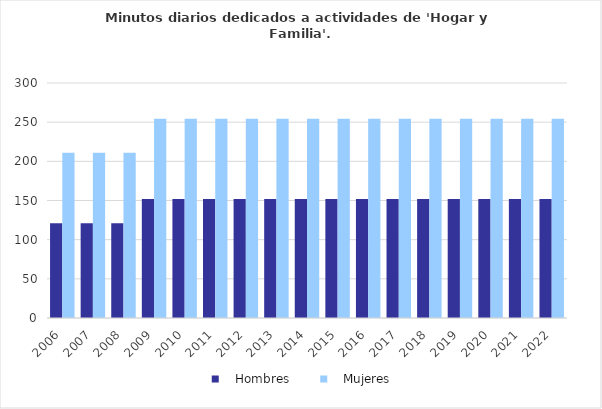
| Category |    Hombres |    Mujeres |
|---|---|---|
| 2006.0 | 121 | 211 |
| 2007.0 | 121 | 211 |
| 2008.0 | 121 | 211 |
| 2009.0 | 152 | 254.5 |
| 2010.0 | 152 | 254.5 |
| 2011.0 | 152 | 254.5 |
| 2012.0 | 152 | 254.5 |
| 2013.0 | 152 | 254.5 |
| 2014.0 | 152 | 254.5 |
| 2015.0 | 152 | 254.5 |
| 2016.0 | 152 | 254.5 |
| 2017.0 | 152 | 254.5 |
| 2018.0 | 152 | 254.5 |
| 2019.0 | 152 | 254.5 |
| 2020.0 | 152 | 254.5 |
| 2021.0 | 152 | 254.5 |
| 2022.0 | 152 | 254.5 |